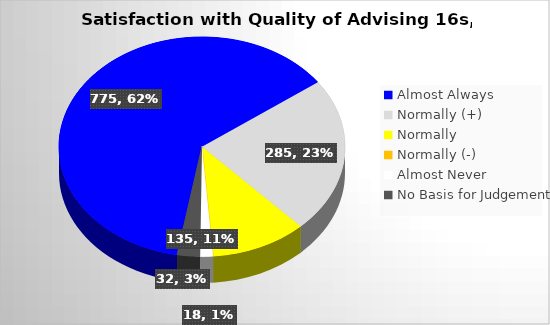
| Category | Series 0 |
|---|---|
| Almost Always | 775 |
| Normally (+) | 285 |
| Normally  | 135 |
| Normally (-) | 0 |
| Almost Never | 18 |
| No Basis for Judgement | 32 |